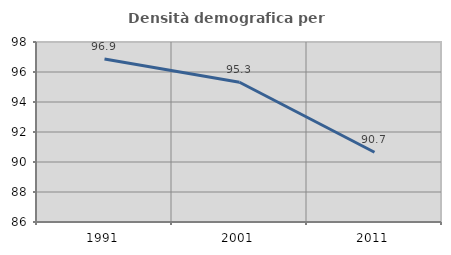
| Category | Densità demografica |
|---|---|
| 1991.0 | 96.87 |
| 2001.0 | 95.315 |
| 2011.0 | 90.65 |